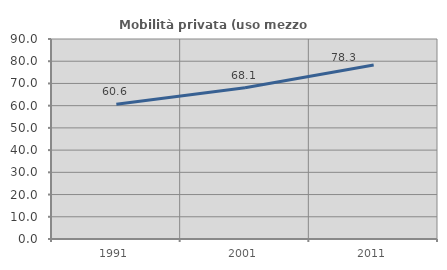
| Category | Mobilità privata (uso mezzo privato) |
|---|---|
| 1991.0 | 60.619 |
| 2001.0 | 68.103 |
| 2011.0 | 78.327 |